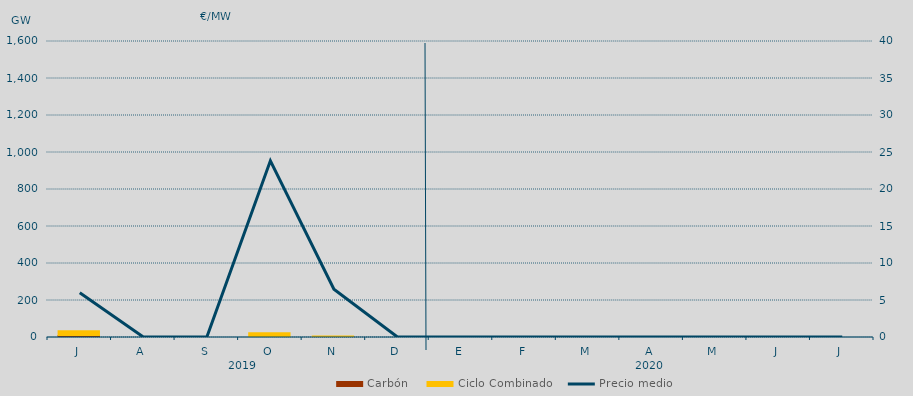
| Category | Carbón | Ciclo Combinado |
|---|---|---|
| J | 10582.1 | 26246.2 |
| A | 0 | 0 |
| S | 0 | 0 |
| O | 0 | 25712.6 |
| N | 0 | 8552.1 |
| D | 0 | 0 |
| E | 0 | 0 |
| F | 0 | 0 |
| M | 0 | 0 |
| A | 0 | 0 |
| M | 0 | 0 |
| J | 0 | 0 |
| J | 0 | 0 |